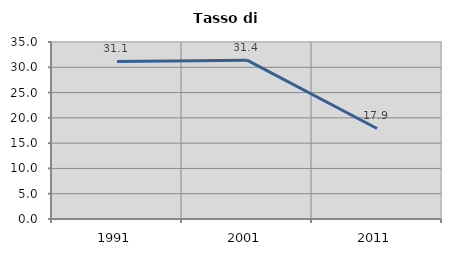
| Category | Tasso di disoccupazione   |
|---|---|
| 1991.0 | 31.147 |
| 2001.0 | 31.402 |
| 2011.0 | 17.902 |